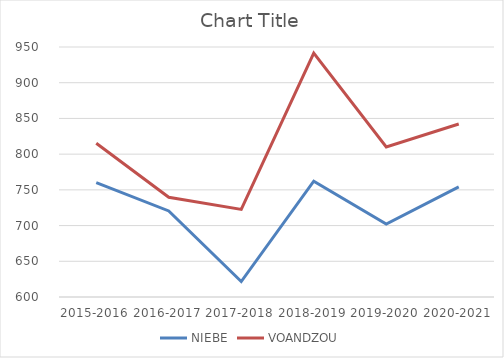
| Category |  NIEBE  |  VOANDZOU  |
|---|---|---|
| 2015-2016 | 760.106 | 815.168 |
| 2016-2017 | 720.48 | 739.628 |
| 2017-2018 | 621.622 | 722.572 |
| 2018-2019 | 762.149 | 941.402 |
| 2019-2020 | 702.11 | 810.046 |
| 2020-2021 | 754.148 | 842.183 |